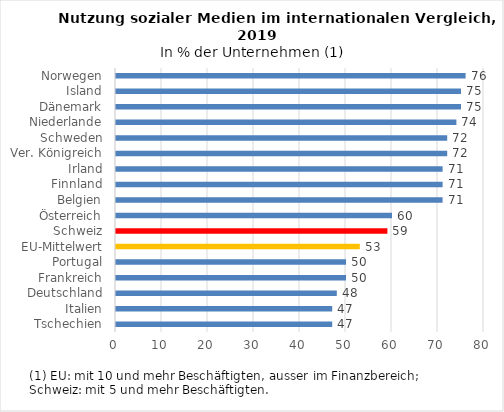
| Category | 2019 |
|---|---|
| Tschechien | 47 |
| Italien | 47 |
| Deutschland | 48 |
| Frankreich | 50 |
| Portugal | 50 |
| EU-Mittelwert | 53 |
| Schweiz | 59 |
| Österreich | 60 |
| Belgien | 71 |
| Finnland | 71 |
| Irland | 71 |
| Ver. Königreich | 72 |
| Schweden | 72 |
| Niederlande | 74 |
| Dänemark | 75 |
| Island | 75 |
| Norwegen | 76 |